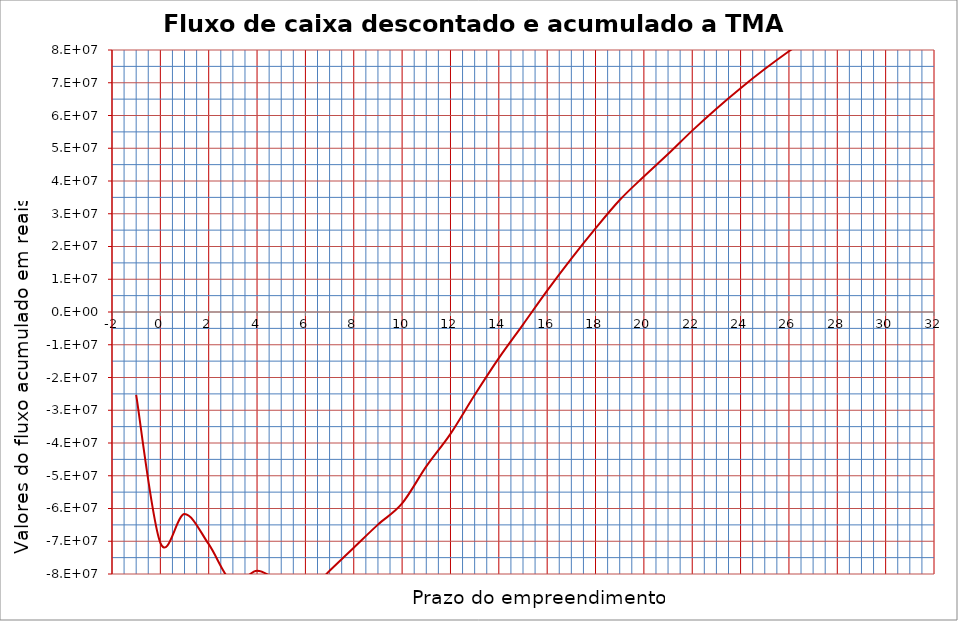
| Category | Series 0 |
|---|---|
| -1.0 | -25329024 |
| 0.0 | -70492107.84 |
| 1.0 | -61693629.48 |
| 2.0 | -70896170.083 |
| 3.0 | -82771613.831 |
| 4.0 | -78977969.241 |
| 5.0 | -82686444.847 |
| 6.0 | -85953044.07 |
| 7.0 | -79020028.628 |
| 8.0 | -71961575.977 |
| 9.0 | -64924683.458 |
| 10.0 | -58440183.033 |
| 11.0 | -47144618.101 |
| 12.0 | -37203445.138 |
| 13.0 | -25345798.861 |
| 14.0 | -14084813.618 |
| 15.0 | -3835956.739 |
| 16.0 | 6511210.227 |
| 17.0 | 16292057.558 |
| 18.0 | 25517810.412 |
| 19.0 | 34190112.571 |
| 20.0 | 41370890.677 |
| 21.0 | 48215054.414 |
| 22.0 | 55380974.208 |
| 23.0 | 62089629.045 |
| 24.0 | 68345675.965 |
| 25.0 | 74176779.82 |
| 26.0 | 79609192.183 |
| 27.0 | 84670261.452 |
| 28.0 | 89383875.174 |
| 29.0 | 93768565.817 |
| 30.0 | 97843342.336 |